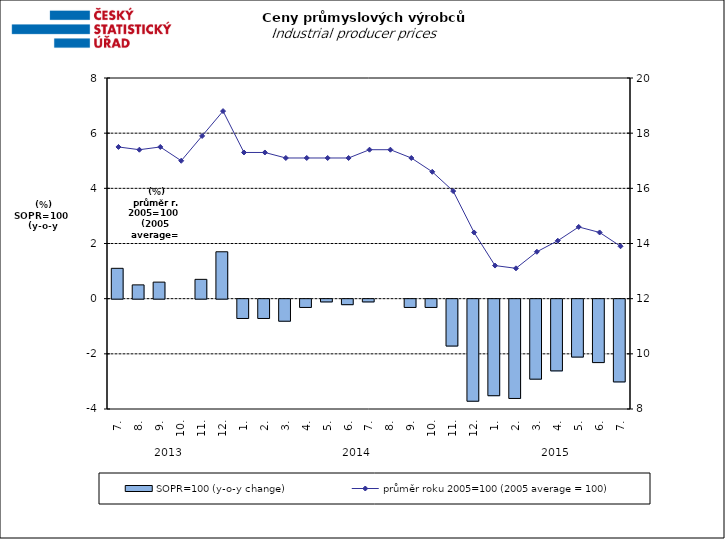
| Category | SOPR=100 (y-o-y change)   |
|---|---|
| 0 | 1.1 |
| 1 | 0.5 |
| 2 | 0.6 |
| 3 | 0 |
| 4 | 0.7 |
| 5 | 1.7 |
| 6 | -0.7 |
| 7 | -0.7 |
| 8 | -0.8 |
| 9 | -0.3 |
| 10 | -0.1 |
| 11 | -0.2 |
| 12 | -0.1 |
| 13 | 0 |
| 14 | -0.3 |
| 15 | -0.3 |
| 16 | -1.7 |
| 17 | -3.7 |
| 18 | -3.5 |
| 19 | -3.6 |
| 20 | -2.9 |
| 21 | -2.6 |
| 22 | -2.1 |
| 23 | -2.3 |
| 24 | -3 |